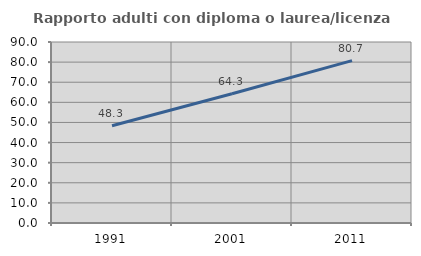
| Category | Rapporto adulti con diploma o laurea/licenza media  |
|---|---|
| 1991.0 | 48.344 |
| 2001.0 | 64.258 |
| 2011.0 | 80.749 |